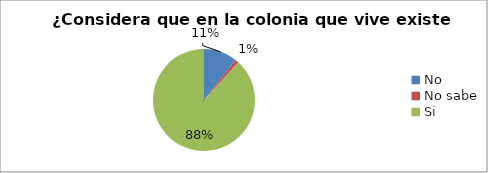
| Category | Series 0 |
|---|---|
| No | 0.106 |
| No sabe | 0.012 |
| Si | 0.882 |